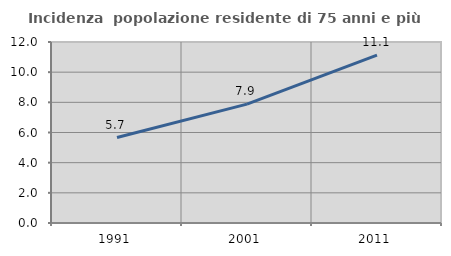
| Category | Incidenza  popolazione residente di 75 anni e più |
|---|---|
| 1991.0 | 5.668 |
| 2001.0 | 7.883 |
| 2011.0 | 11.136 |